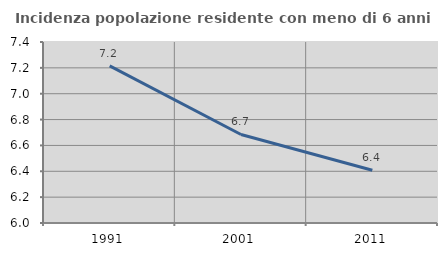
| Category | Incidenza popolazione residente con meno di 6 anni |
|---|---|
| 1991.0 | 7.215 |
| 2001.0 | 6.685 |
| 2011.0 | 6.408 |